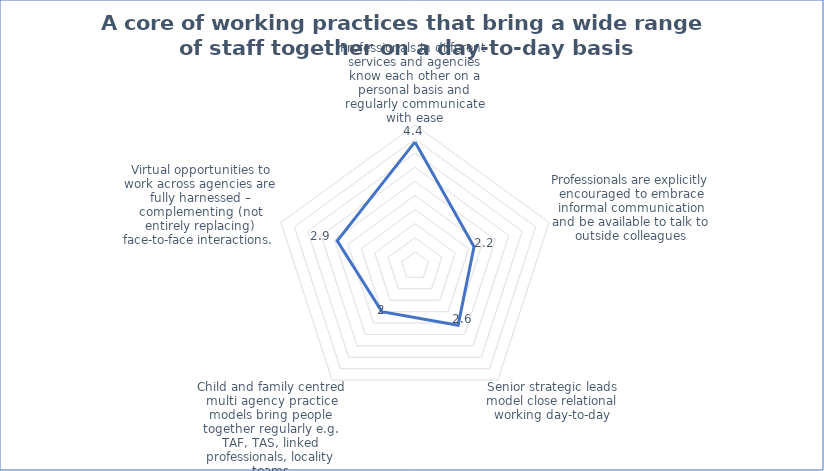
| Category | Series 0 |
|---|---|
| Professionals in different services and agencies know each other on a personal basis and regularly communicate with ease | 4.4 |
| Professionals are explicitly encouraged to embrace informal communication and be available to talk to outside colleagues | 2.2 |
| Senior strategic leads model close relational working day-to-day | 2.6 |
| Child and family centred multi agency practice models bring people together regularly e.g. TAF, TAS, linked professionals, locality teams | 2 |
| Virtual opportunities to work across agencies are fully harnessed – complementing (not entirely replacing) face-to-face interactions.  | 2.9 |